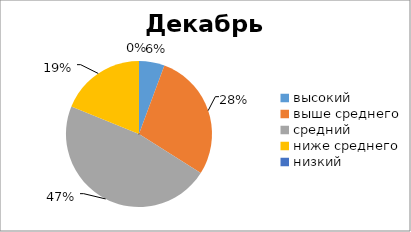
| Category | Series 0 |
|---|---|
| высокий | 3 |
| выше среднего | 15 |
| средний | 25 |
| ниже среднего | 10 |
| низкий | 0 |